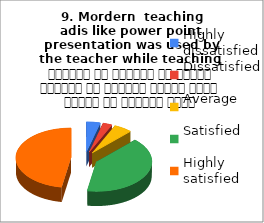
| Category |  9. Mordern  teaching 
adis like power point presentation was used by the teacher while teaching  शिक्षक ने शिक्षण के दौरान शिक्षण की आधुनिक तकनीक पावर पॉइंट का प्रयोग किया |
|---|---|
| Highly dissatisfied | 3 |
| Dissatisfied | 2 |
| Average | 4 |
| Satisfied | 30 |
| Highly satisfied | 35 |